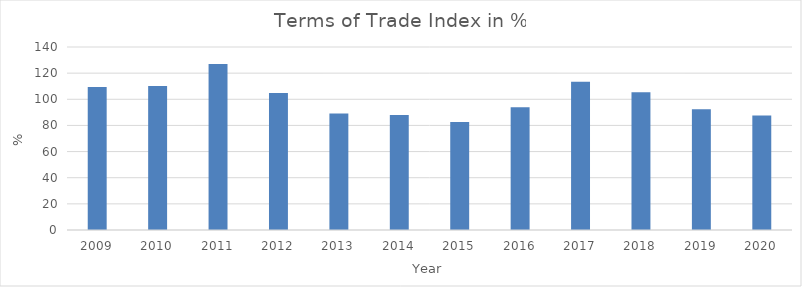
| Category | Terms of Trade |
|---|---|
| 2009.0 | 109.325 |
| 2010.0 | 110.18 |
| 2011.0 | 127.035 |
| 2012.0 | 104.828 |
| 2013.0 | 89.184 |
| 2014.0 | 88.073 |
| 2015.0 | 82.584 |
| 2016.0 | 93.986 |
| 2017.0 | 113.483 |
| 2018.0 | 105.468 |
| 2019.0 | 92.394 |
| 2020.0 | 87.571 |